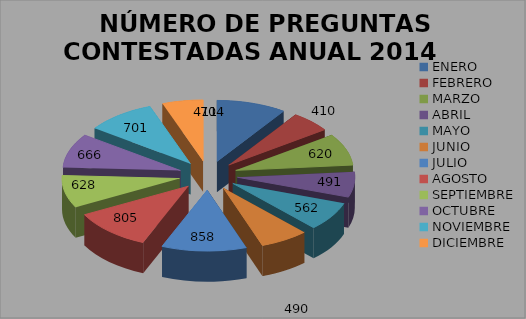
| Category |  NÚMERO DE PREGUNTAS CONTESTADAS ANUAL 2014 |
|---|---|
| ENERO | 704 |
| FEBRERO | 410 |
| MARZO | 620 |
| ABRIL | 491 |
| MAYO | 562 |
| JUNIO | 490 |
| JULIO | 858 |
| AGOSTO | 805 |
| SEPTIEMBRE | 628 |
| OCTUBRE | 666 |
| NOVIEMBRE | 701 |
| DICIEMBRE | 411 |